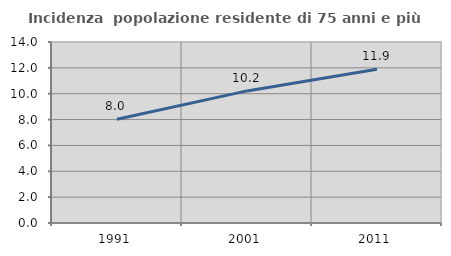
| Category | Incidenza  popolazione residente di 75 anni e più |
|---|---|
| 1991.0 | 8.02 |
| 2001.0 | 10.217 |
| 2011.0 | 11.899 |